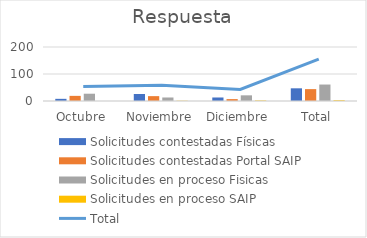
| Category | Solicitudes contestadas Físicas | Solicitudes contestadas Portal SAIP | Solicitudes en proceso Fisicas | Solicitudes en proceso SAIP |
|---|---|---|---|---|
| Octubre | 8 | 19 | 27 | 0 |
| Noviembre | 26 | 18 | 13 | 1 |
| Diciembre | 13 | 7 | 21 | 2 |
| Total | 47 | 44 | 61 | 3 |